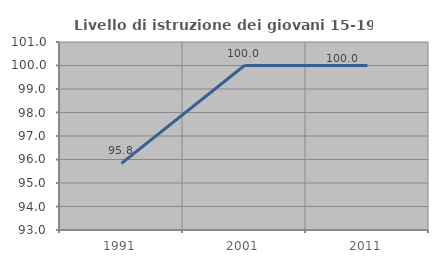
| Category | Livello di istruzione dei giovani 15-19 anni |
|---|---|
| 1991.0 | 95.833 |
| 2001.0 | 100 |
| 2011.0 | 100 |